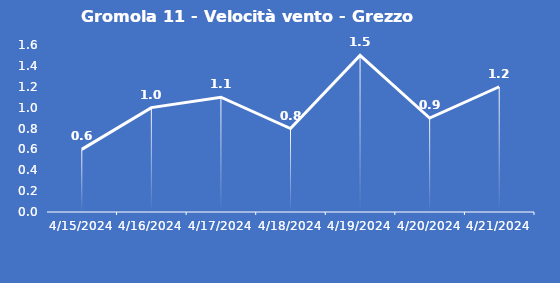
| Category | Gromola 11 - Velocità vento - Grezzo (m/s) |
|---|---|
| 4/15/24 | 0.6 |
| 4/16/24 | 1 |
| 4/17/24 | 1.1 |
| 4/18/24 | 0.8 |
| 4/19/24 | 1.5 |
| 4/20/24 | 0.9 |
| 4/21/24 | 1.2 |